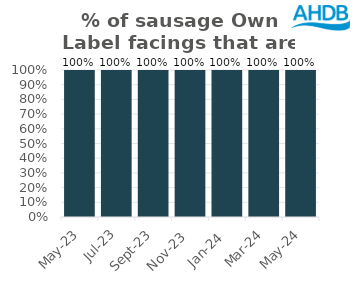
| Category | Sausage |
|---|---|
| 2023-05-01 | 1 |
| 2023-07-01 | 1 |
| 2023-09-01 | 1 |
| 2023-11-01 | 1 |
| 2024-01-01 | 1 |
| 2024-03-01 | 1 |
| 2024-05-01 | 1 |